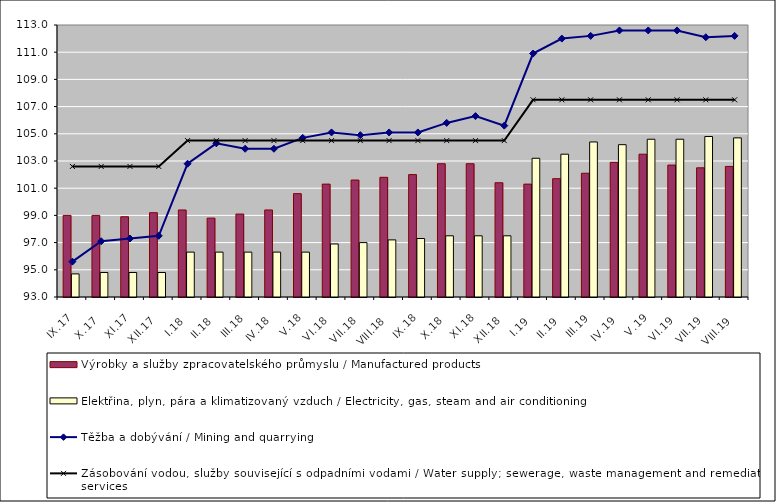
| Category | Výrobky a služby zpracovatelského průmyslu / Manufactured products | Elektřina, plyn, pára a klimatizovaný vzduch / Electricity, gas, steam and air conditioning |
|---|---|---|
| IX.17 | 99 | 94.7 |
| X.17 | 99 | 94.8 |
| XI.17 | 98.9 | 94.8 |
| XII.17 | 99.2 | 94.8 |
| I.18 | 99.4 | 96.3 |
| II.18 | 98.8 | 96.3 |
| III.18 | 99.1 | 96.3 |
| IV.18 | 99.4 | 96.3 |
| V.18 | 100.6 | 96.3 |
| VI.18 | 101.3 | 96.9 |
| VII.18 | 101.6 | 97 |
| VIII.18 | 101.8 | 97.2 |
| IX.18 | 102 | 97.3 |
| X.18 | 102.8 | 97.5 |
| XI.18 | 102.8 | 97.5 |
| XII.18 | 101.4 | 97.5 |
| I.19 | 101.3 | 103.2 |
| II.19 | 101.7 | 103.5 |
| III.19 | 102.1 | 104.4 |
| IV.19 | 102.9 | 104.2 |
| V.19 | 103.5 | 104.6 |
| VI.19 | 102.7 | 104.6 |
| VII.19 | 102.5 | 104.8 |
| VIII.19 | 102.6 | 104.7 |